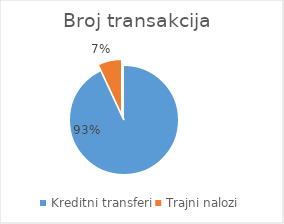
| Category | Broj transakcija  |
|---|---|
| Kreditni transferi | 328830660 |
| Trajni nalozi | 24524071 |